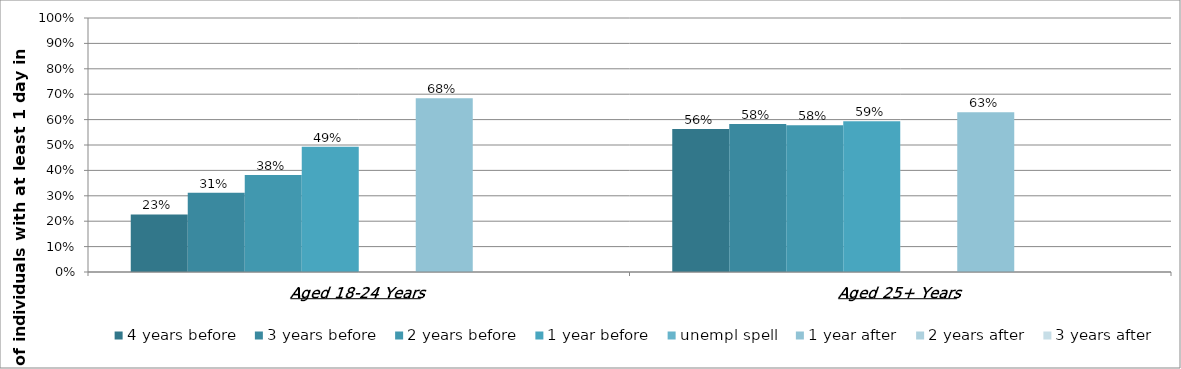
| Category | 4 years before | 3 years before | 2 years before | 1 year before | unempl spell | 1 year after | 2 years after | 3 years after |
|---|---|---|---|---|---|---|---|---|
| Aged 18-24 Years | 0.227 | 0.312 | 0.382 | 0.493 |  | 0.684 |  |  |
| Aged 25+ Years | 0.563 | 0.583 | 0.578 | 0.593 |  | 0.629 |  |  |